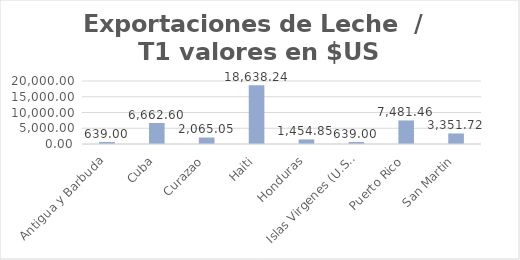
| Category | Valor US  |
|---|---|
| Antigua y Barbuda | 639 |
| Cuba | 6662.6 |
| Curazao | 2065.05 |
| Haiti | 18638.239 |
| Honduras | 1454.85 |
| Islas Virgenes (U.S.) | 639 |
| Puerto Rico | 7481.46 |
| San Martin | 3351.72 |